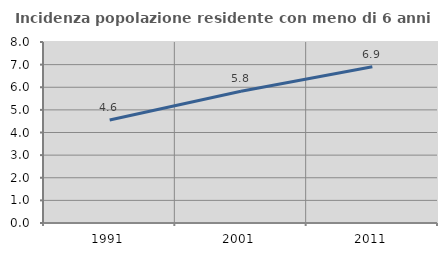
| Category | Incidenza popolazione residente con meno di 6 anni |
|---|---|
| 1991.0 | 4.55 |
| 2001.0 | 5.825 |
| 2011.0 | 6.91 |